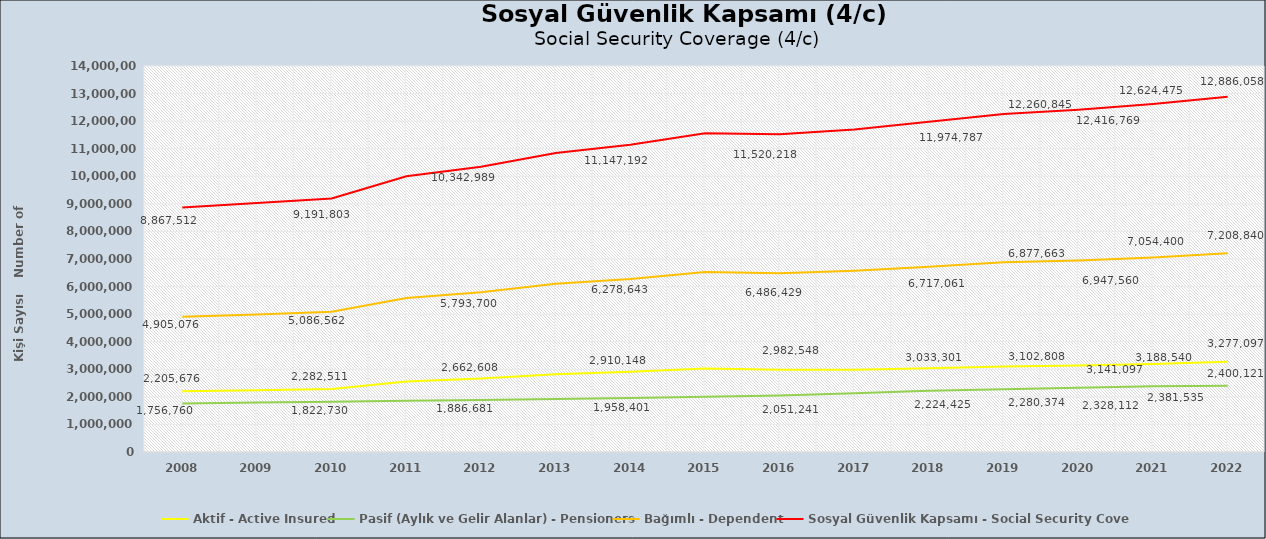
| Category | Aktif - Active Insured | Pasif (Aylık ve Gelir Alanlar) - Pensioners | Bağımlı - Dependent | Sosyal Güvenlik Kapsamı - Social Security Coverage |
|---|---|---|---|---|
| 2008.0 | 2205676 | 1756760 | 4905076 | 8867512 |
| 2009.0 | 2241418 | 1795334 | 4991459 | 9028211 |
| 2010.0 | 2282511 | 1822730 | 5086562 | 9191803 |
| 2011.0 | 2554200 | 1856273 | 5588399 | 9998872 |
| 2012.0 | 2662608 | 1886681 | 5793700 | 10342989 |
| 2013.0 | 2823400 | 1923921 | 6098997 | 10846318 |
| 2014.0 | 2910148 | 1958401 | 6278643 | 11147192 |
| 2015.0 | 3032971 | 2002355 | 6525050 | 11560376 |
| 2016.0 | 2982548 | 2051241 | 6486429 | 11520218 |
| 2017.0 | 2987396 | 2134646 | 6574072 | 11696114 |
| 2018.0 | 3033301 | 2224425 | 6717061 | 11974787 |
| 2019.0 | 3102808 | 2280374 | 6877663 | 12260845 |
| 2020.0 | 3141097 | 2328112 | 6947560 | 12416769 |
| 2021.0 | 3188540 | 2381535 | 7054400 | 12624475 |
| 2022.0 | 3277097 | 2400121 | 7208840 | 12886058 |